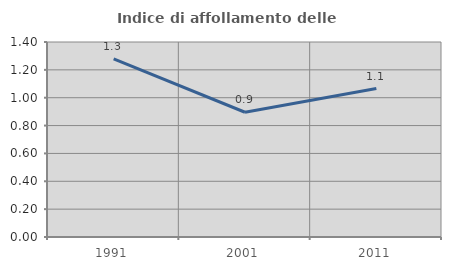
| Category | Indice di affollamento delle abitazioni  |
|---|---|
| 1991.0 | 1.279 |
| 2001.0 | 0.896 |
| 2011.0 | 1.065 |